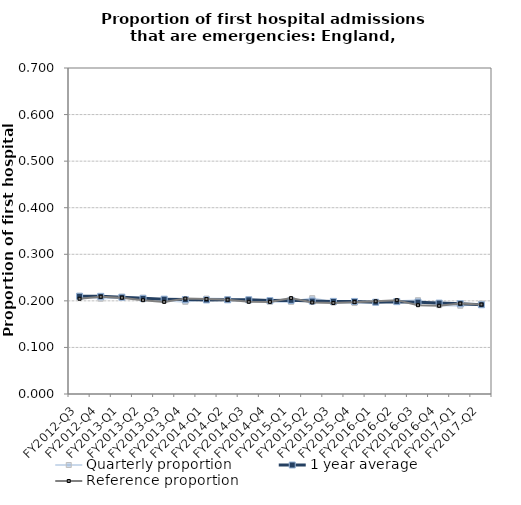
| Category | Quarterly proportion | 1 year average | Reference proportion |
|---|---|---|---|
| FY2012-Q3 | 0.211 | 0.21 | 0.204 |
| FY2012-Q4 | 0.204 | 0.21 | 0.209 |
| FY2013-Q1 | 0.209 | 0.208 | 0.207 |
| FY2013-Q2 | 0.207 | 0.205 | 0.201 |
| FY2013-Q3 | 0.201 | 0.204 | 0.198 |
| FY2013-Q4 | 0.198 | 0.203 | 0.205 |
| FY2014-Q1 | 0.205 | 0.202 | 0.204 |
| FY2014-Q2 | 0.204 | 0.202 | 0.203 |
| FY2014-Q3 | 0.203 | 0.202 | 0.198 |
| FY2014-Q4 | 0.198 | 0.201 | 0.198 |
| FY2015-Q1 | 0.198 | 0.201 | 0.206 |
| FY2015-Q2 | 0.206 | 0.2 | 0.196 |
| FY2015-Q3 | 0.196 | 0.199 | 0.195 |
| FY2015-Q4 | 0.195 | 0.199 | 0.197 |
| FY2016-Q1 | 0.197 | 0.197 | 0.199 |
| FY2016-Q2 | 0.199 | 0.198 | 0.202 |
| FY2016-Q3 | 0.202 | 0.197 | 0.191 |
| FY2016-Q4 | 0.191 | 0.195 | 0.189 |
| FY2017-Q1 | 0.189 | 0.194 | 0.194 |
| FY2017-Q2 | 0.194 | 0.192 | 0.192 |